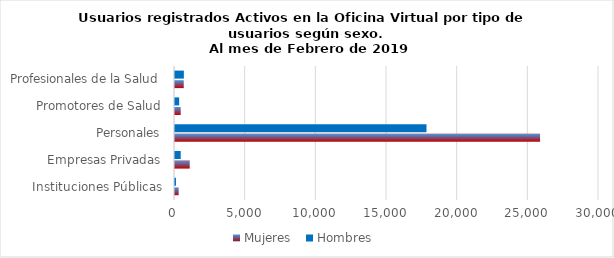
| Category | Mujeres | Hombres |
|---|---|---|
| Instituciones Públicas | 259 | 69 |
| Empresas Privadas | 1042 | 404 |
| Personales | 25830 | 17794 |
| Promotores de Salud | 403 | 294 |
| Profesionales de la Salud | 619 | 627 |